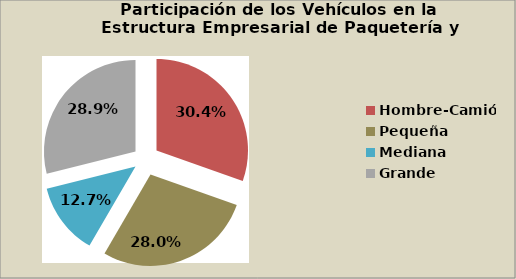
| Category | Series 0 |
|---|---|
| Hombre-Camión | 30.423 |
| Pequeña | 27.96 |
| Mediana | 12.724 |
| Grande | 28.893 |